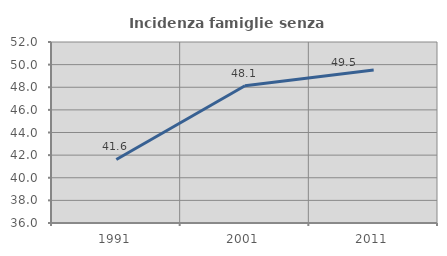
| Category | Incidenza famiglie senza nuclei |
|---|---|
| 1991.0 | 41.62 |
| 2001.0 | 48.137 |
| 2011.0 | 49.531 |